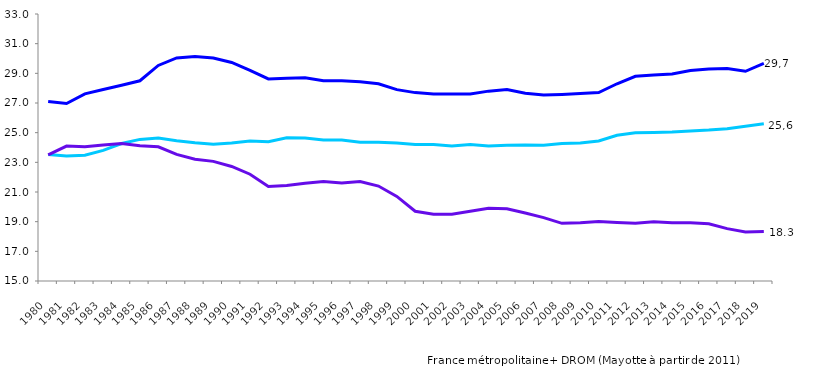
| Category | Formation en collège (1) | Formation pro en lycée | Formation GT en lycée |
|---|---|---|---|
| 1980.0 | 23.523 | 23.5 | 27.1 |
| 1981.0 | 23.423 | 24.099 | 26.961 |
| 1982.0 | 23.485 | 24.043 | 27.62 |
| 1983.0 | 23.805 | 24.165 | 27.908 |
| 1984.0 | 24.267 | 24.266 | 28.202 |
| 1985.0 | 24.546 | 24.121 | 28.5 |
| 1986.0 | 24.644 | 24.044 | 29.532 |
| 1987.0 | 24.462 | 23.532 | 30.038 |
| 1988.0 | 24.321 | 23.21 | 30.138 |
| 1989.0 | 24.221 | 23.066 | 30.038 |
| 1990.0 | 24.3 | 22.721 | 29.732 |
| 1991.0 | 24.441 | 22.199 | 29.196 |
| 1992.0 | 24.382 | 21.377 | 28.62 |
| 1993.0 | 24.662 | 21.444 | 28.667 |
| 1994.0 | 24.641 | 21.589 | 28.708 |
| 1995.0 | 24.5 | 21.7 | 28.5 |
| 1996.0 | 24.5 | 21.6 | 28.5 |
| 1997.0 | 24.362 | 21.7 | 28.431 |
| 1998.0 | 24.362 | 21.4 | 28.3 |
| 1999.0 | 24.3 | 20.7 | 27.9 |
| 2000.0 | 24.2 | 19.7 | 27.7 |
| 2001.0 | 24.2 | 19.5 | 27.6 |
| 2002.0 | 24.1 | 19.5 | 27.6 |
| 2003.0 | 24.2 | 19.7 | 27.6 |
| 2004.0 | 24.1 | 19.9 | 27.8 |
| 2005.0 | 24.155 | 19.867 | 27.907 |
| 2006.0 | 24.166 | 19.581 | 27.664 |
| 2007.0 | 24.145 | 19.276 | 27.532 |
| 2008.0 | 24.274 | 18.886 | 27.575 |
| 2009.0 | 24.307 | 18.931 | 27.632 |
| 2010.0 | 24.438 | 19.007 | 27.705 |
| 2011.0 | 24.828 | 18.944 | 28.297 |
| 2012.0 | 24.998 | 18.899 | 28.798 |
| 2013.0 | 25.017 | 18.988 | 28.886 |
| 2014.0 | 25.053 | 18.932 | 28.962 |
| 2015.0 | 25.12 | 18.928 | 29.19 |
| 2016.0 | 25.175 | 18.864 | 29.297 |
| 2017.0 | 25.27 | 18.533 | 29.319 |
| 2018.0 | 25.433 | 18.297 | 29.138 |
| 2019.0 | 25.601 | 18.332 | 29.664 |